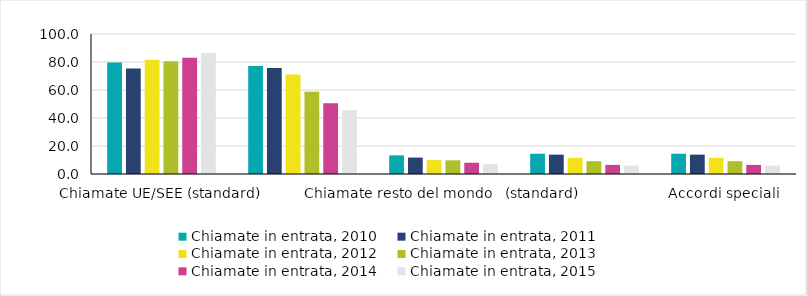
| Category | Chiamate in entrata, 2010 | Chiamate in entrata, 2011 | Chiamate in entrata, 2012 | Chiamate in entrata, 2013 | Chiamate in entrata, 2014 | Chiamate in entrata, 2015 |
|---|---|---|---|---|---|---|
| Chiamate UE/SEE (standard) | 79.691 | 75.401 | 81.659 | 80.601 | 83.089 | 86.415 |
| Chiamate UE/SEE (opzione) | 77.154 | 75.797 | 71.147 | 58.747 | 50.538 | 45.556 |
| Chiamate resto del mondo   (standard) | 13.319 | 11.742 | 9.923 | 9.754 | 8.04 | 7.04 |
| Chiamate resto del mondo (opzione) | 14.485 | 13.826 | 11.545 | 9.162 | 6.512 | 6.011 |
|  Accordi speciali  | 14.485 | 13.826 | 11.545 | 9.162 | 6.512 | 6.011 |